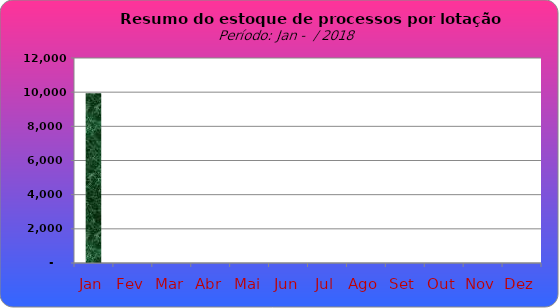
| Category | Series 0 |
|---|---|
| Jan | 9933 |
| Fev | 0 |
| Mar | 0 |
| Abr | 0 |
| Mai | 0 |
| Jun | 0 |
| Jul | 0 |
| Ago | 0 |
| Set | 0 |
| Out | 0 |
| Nov | 0 |
| Dez | 0 |